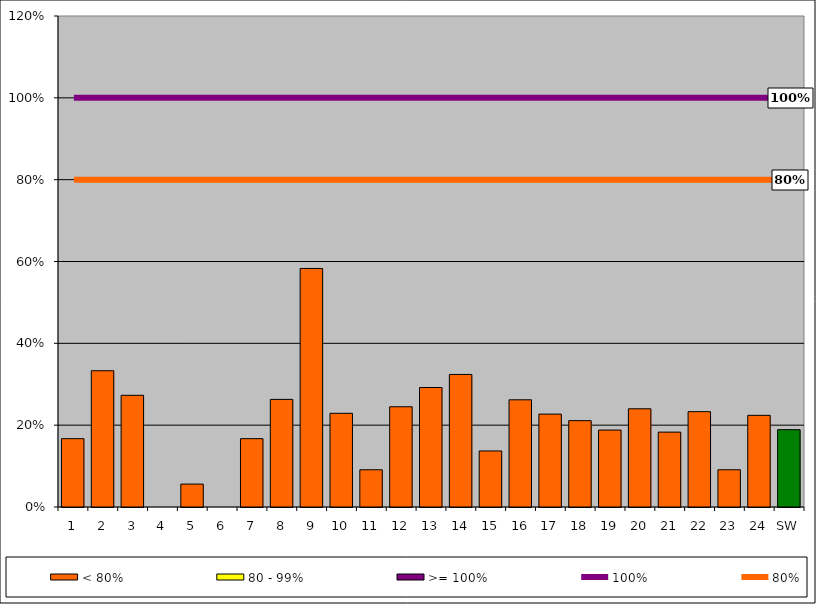
| Category | < 80% | 80 - 99% | >= 100% |
|---|---|---|---|
| 1 | 0.167 | 0 | 0 |
| 2 | 0.333 | 0 | 0 |
| 3 | 0.273 | 0 | 0 |
| 4 | 0 | 0 | 0 |
| 5 | 0.056 | 0 | 0 |
| 6 | 0 | 0 | 0 |
| 7 | 0.167 | 0 | 0 |
| 8 | 0.263 | 0 | 0 |
| 9 | 0.583 | 0 | 0 |
| 10 | 0.229 | 0 | 0 |
| 11 | 0.091 | 0 | 0 |
| 12 | 0.245 | 0 | 0 |
| 13 | 0.292 | 0 | 0 |
| 14 | 0.324 | 0 | 0 |
| 15 | 0.137 | 0 | 0 |
| 16 | 0.262 | 0 | 0 |
| 17 | 0.227 | 0 | 0 |
| 18 | 0.211 | 0 | 0 |
| 19 | 0.188 | 0 | 0 |
| 20 | 0.24 | 0 | 0 |
| 21 | 0.183 | 0 | 0 |
| 22 | 0.233 | 0 | 0 |
| 23 | 0.091 | 0 | 0 |
| 24 | 0.224 | 0 | 0 |
| SW | 0.189 | 0 | 0 |